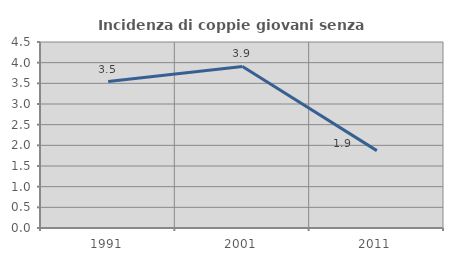
| Category | Incidenza di coppie giovani senza figli |
|---|---|
| 1991.0 | 3.542 |
| 2001.0 | 3.909 |
| 2011.0 | 1.872 |